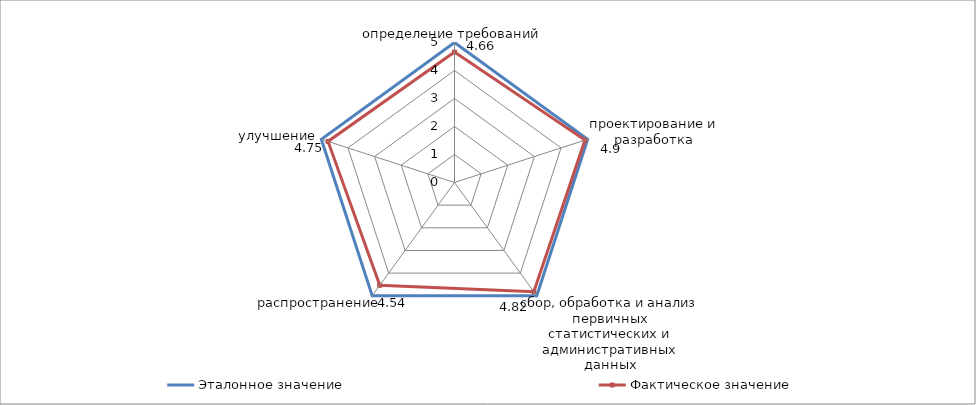
| Category | Эталонное значение | Фактическое значение |
|---|---|---|
| определение требований | 5 | 4.66 |
| проектирование и разработка | 5 | 4.9 |
| сбор, обработка и анализ первичных статистических и административных данных | 5 | 4.82 |
| распространение | 5 | 4.54 |
| улучшение | 5 | 4.75 |